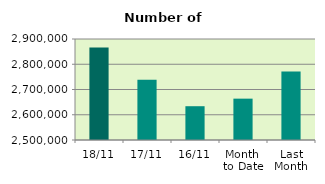
| Category | Series 0 |
|---|---|
| 18/11 | 2865982 |
| 17/11 | 2738570 |
| 16/11 | 2633816 |
| Month 
to Date | 2663749.714 |
| Last
Month | 2771381.143 |